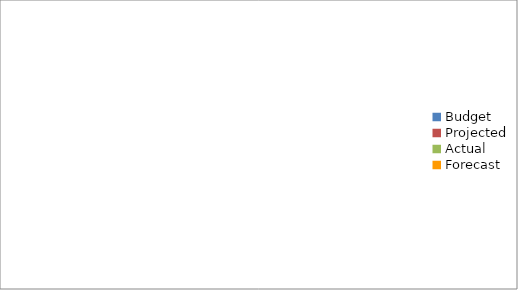
| Category | Series 0 |
|---|---|
| Budget | 3170 |
| Projected | 1580 |
| Actual | 1830 |
| Forecast | 950 |